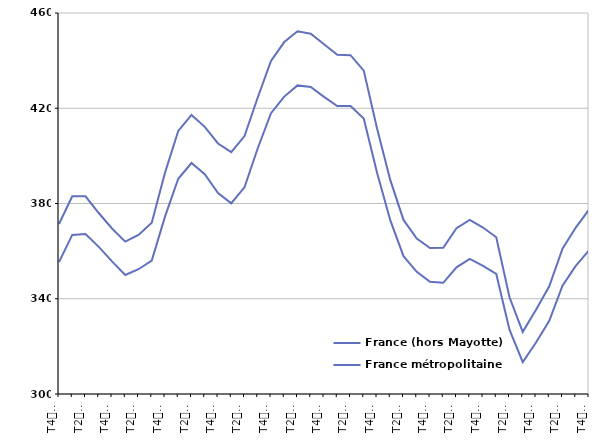
| Category | France (hors Mayotte) | France métropolitaine |
|---|---|---|
| T4
2011 | 371.4 | 355.4 |
| T1
2012 | 383 | 366.8 |
| T2
2012 | 383 | 367.2 |
| T3
2012 | 376 | 361.8 |
| T4
2012 | 369.5 | 355.7 |
| T1
2013 | 364 | 350 |
| T2
2013 | 366.8 | 352.4 |
| T3
2013 | 371.9 | 356 |
| T4
2013 | 392.9 | 374.5 |
| T1
2014 | 410.5 | 390.4 |
| T2
2014 | 417.2 | 397 |
| T3
2014 | 412.2 | 392.3 |
| T4
2014 | 405.2 | 384.4 |
| T1
2015 | 401.6 | 380.1 |
| T2
2015 | 408.3 | 386.8 |
| T3
2015 | 424.5 | 403.2 |
| T4
2015 | 439.9 | 417.9 |
| T1
2016 | 447.8 | 424.9 |
| T2
2016 | 452.3 | 429.6 |
| T3
2016 | 451.3 | 428.9 |
| T4
2016 | 446.9 | 424.8 |
| T1
2017 | 442.5 | 420.9 |
| T2
2017 | 442.3 | 420.9 |
| T3
2017 | 435.8 | 415.7 |
| T4
2017 | 411.6 | 393 |
| T1
2018 | 389.9 | 373 |
| T2
2018 | 373.1 | 357.9 |
| T3
2018 | 365.3 | 351.3 |
| T4
2018 | 361.3 | 347.1 |
| T1
2019 | 361.4 | 346.7 |
| T2
2019 | 369.6 | 353.2 |
| T3
2019 | 373.1 | 356.7 |
| T4
2019 | 369.9 | 353.8 |
| T1
2020 | 365.8 | 350.4 |
| T2
2020 | 340.6 | 327 |
| T3
2020 | 326.1 | 313.4 |
| T4
2020 | 335.4 | 321.6 |
| T1
2021 | 345.2 | 330.7 |
| T2
2021 | 361 | 345.5 |
| T3
2021 | 369.9 | 353.8 |
| T4
2021 | 377.4 | 360.3 |